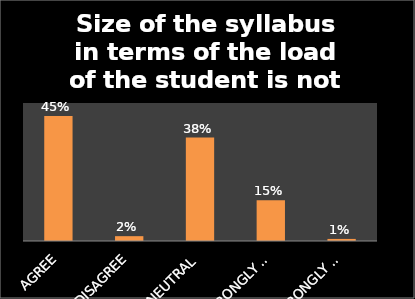
| Category | Series 0 |
|---|---|
| AGREE | 0.452 |
| DISAGREE | 0.018 |
| NEUTRAL | 0.375 |
| STRONGLY AGREE | 0.148 |
| STRONGLY DISAGREE | 0.008 |